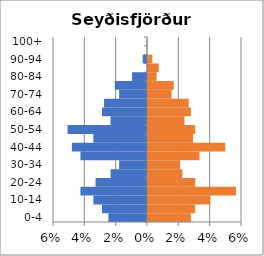
| Category | % Men | % Women |
|---|---|---|
| 0-4 | -0.025 | 0.027 |
| 5-9 | -0.029 | 0.03 |
| 10-14 | -0.034 | 0.04 |
| 15-19 | -0.042 | 0.056 |
| 20-24 | -0.033 | 0.03 |
| 25-29 | -0.023 | 0.022 |
| 30-34 | -0.018 | 0.021 |
| 35-39 | -0.042 | 0.033 |
| 40-44 | -0.048 | 0.049 |
| 45-49 | -0.034 | 0.029 |
| 50-54 | -0.051 | 0.03 |
| 55-59 | -0.023 | 0.023 |
| 60-64 | -0.029 | 0.027 |
| 65-69 | -0.027 | 0.026 |
| 70-74 | -0.018 | 0.015 |
| 75-79 | -0.021 | 0.016 |
| 80-84 | -0.01 | 0.005 |
| 85-89 | 0 | 0.007 |
| 90-94 | -0.003 | 0.003 |
| 95-99 | 0 | 0 |
| 100+ | 0 | 0 |